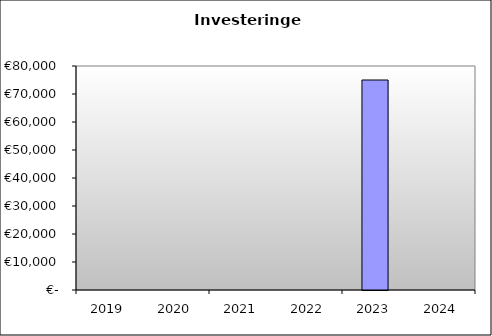
| Category | Investeringen |
|---|---|
| 2019.0 | 0 |
| 2020.0 | 0 |
| 2021.0 | 0 |
| 2022.0 | 0 |
| 2023.0 | 75000 |
| 2024.0 | 0 |